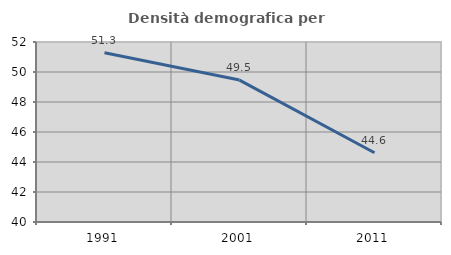
| Category | Densità demografica |
|---|---|
| 1991.0 | 51.278 |
| 2001.0 | 49.461 |
| 2011.0 | 44.616 |